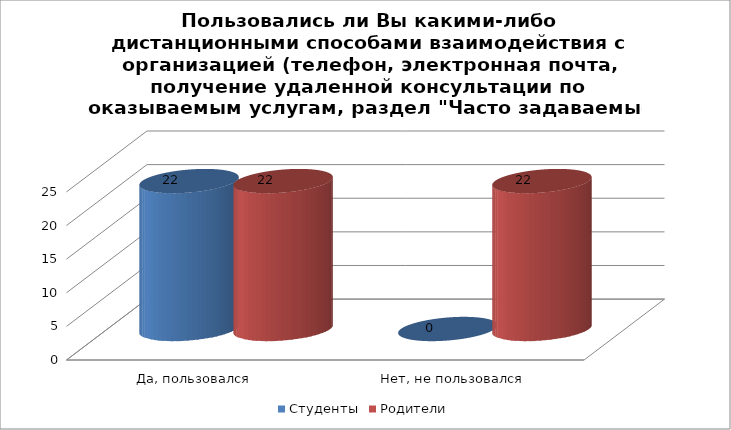
| Category | Студенты | Родители |
|---|---|---|
| Да, пользовался | 22 | 22 |
| Нет, не пользовался | 0 | 22 |